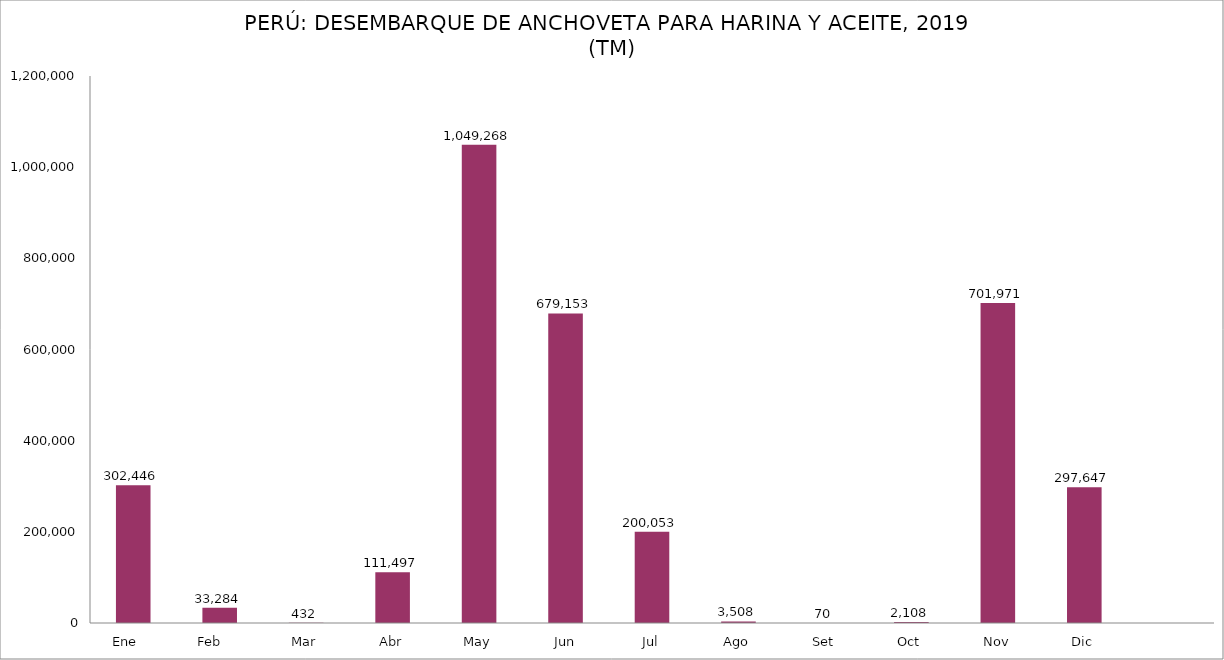
| Category | Series 0 |
|---|---|
| Ene    | 302446.106 |
| Feb     | 33283.67 |
| Mar | 432.321 |
| Abr | 111496.972 |
| May | 1049268.438 |
| Jun | 679153.25 |
| Jul | 200052.641 |
| Ago | 3507.521 |
| Set | 69.976 |
| Oct | 2108.452 |
| Nov | 701971.208 |
| Dic | 297646.666 |